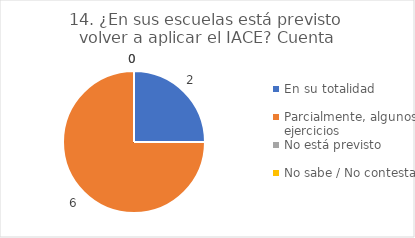
| Category | 14. ¿En sus escuelas está previsto volver a aplicar el IACE? |
|---|---|
| En su totalidad  | 0.25 |
| Parcialmente, algunos ejercicios  | 0.75 |
| No está previsto  | 0 |
| No sabe / No contesta | 0 |